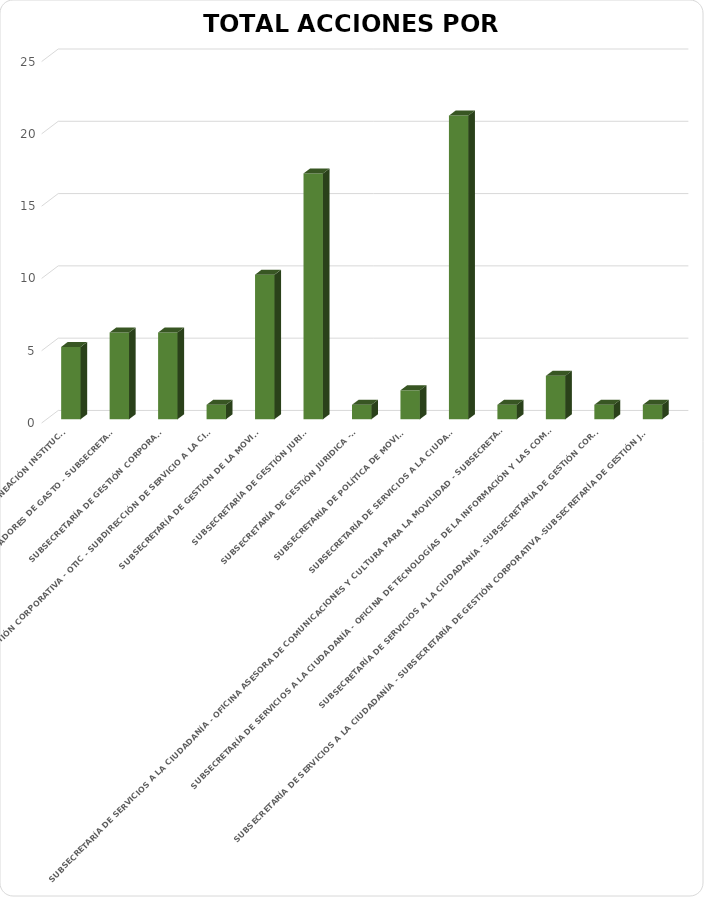
| Category | Total |
|---|---|
| OFICINA ASESORA DE PLANEACIÓN INSTITUCIONAL | 5 |
| ORDENADORES DE GASTO - SUBSECRETARIOS | 6 |
| SUBSECRETARÍA DE GESTIÓN CORPORATIVA  | 6 |
| SUBSECRETARÍA DE GESTIÓN CORPORATIVA - OTIC - SUBDIRECCIÓN DE SERVICIO A LA CIUDADANÍA | 1 |
| SUBSECRETARÍA DE GESTIÓN DE LA MOVILIDAD | 10 |
| SUBSECRETARÍA DE GESTIÓN JURIDICA | 17 |
| SUBSECRETARÍA DE GESTIÓN JURIDICA - OTIC | 1 |
| SUBSECRETARÍA DE POLÍTICA DE MOVILIDAD | 2 |
| SUBSECRETARÍA DE SERVICIOS A LA CIUDADANÍA | 21 |
| SUBSECRETARÍA DE SERVICIOS A LA CIUDADANÍA - OFICINA ASESORA DE COMUNICACIONES Y CULTURA PARA LA MOVILIDAD - SUBSECRETARÍA DE GESTIÓN DE LA MOVILIDAD  | 1 |
| SUBSECRETARÍA DE SERVICIOS A LA CIUDADANÍA - OFICINA DE TECNOLOGÍAS DE LA INFORMACIÓN Y LAS COMUNICACIONES | 3 |
| SUBSECRETARÍA DE SERVICIOS A LA CIUDADANÍA - SUBSECRETARÍA DE GESTIÓN CORPORATIVA  | 1 |
| SUBSECRETARÍA DE SERVICIOS A LA CIUDADANÍA - SUBSECRETARÍA DE GESTIÓN CORPORATIVA -SUBSECRETARÍA DE GESTIÓN JURÍDICA - OTIC | 1 |